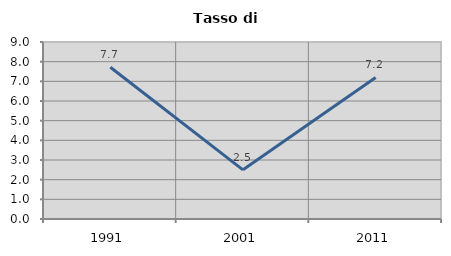
| Category | Tasso di disoccupazione   |
|---|---|
| 1991.0 | 7.717 |
| 2001.0 | 2.5 |
| 2011.0 | 7.2 |